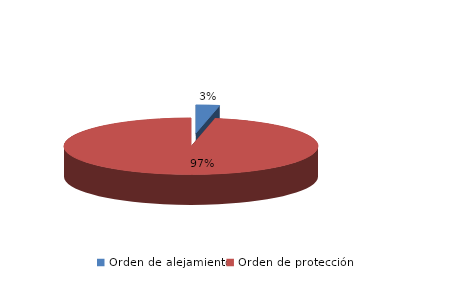
| Category | Series 0 |
|---|---|
| Orden de alejamiento | 3 |
| Orden de protección | 97 |